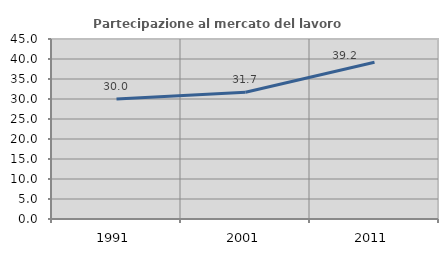
| Category | Partecipazione al mercato del lavoro  femminile |
|---|---|
| 1991.0 | 29.99 |
| 2001.0 | 31.691 |
| 2011.0 | 39.206 |